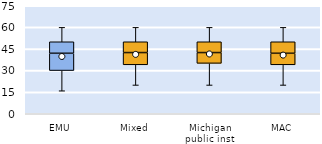
| Category | 25th | 50th | 75th |
|---|---|---|---|
| EMU | 30 | 12 | 8 |
| Mixed | 34 | 8.5 | 7.5 |
| Michigan public inst | 35 | 7.5 | 7.5 |
| MAC | 34 | 8 | 8 |